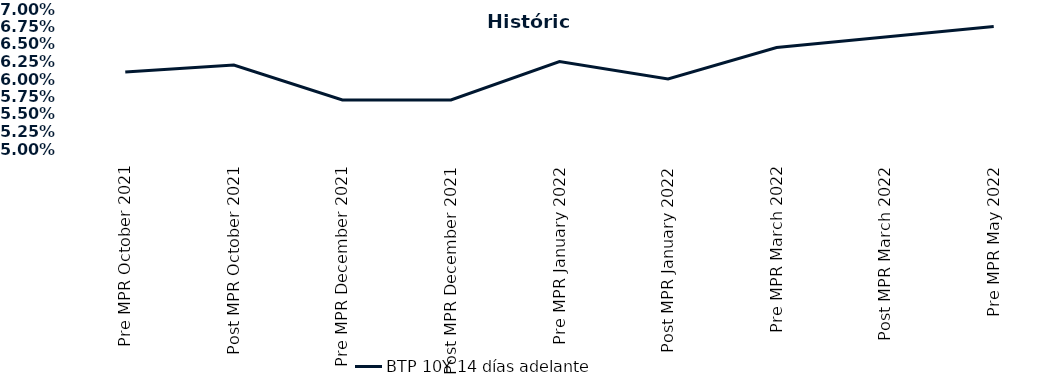
| Category | BTP 10Y 14 días adelante |
|---|---|
| Pre MPR October 2021 | 0.061 |
| Post MPR October 2021 | 0.062 |
| Pre MPR December 2021 | 0.057 |
| Post MPR December 2021 | 0.057 |
| Pre MPR January 2022 | 0.062 |
| Post MPR January 2022 | 0.06 |
| Pre MPR March 2022 | 0.064 |
| Post MPR March 2022 | 0.066 |
| Pre MPR May 2022 | 0.068 |